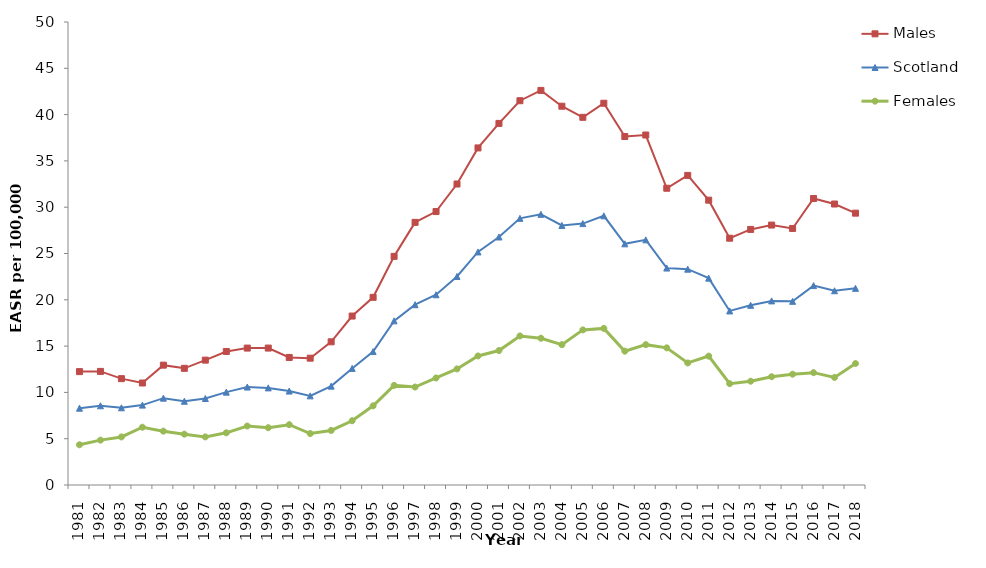
| Category | Males | Scotland | Females |
|---|---|---|---|
| 1981.0 | 12.244 | 8.294 | 4.344 |
| 1982.0 | 12.266 | 8.556 | 4.846 |
| 1983.0 | 11.485 | 8.338 | 5.191 |
| 1984.0 | 11.014 | 8.627 | 6.241 |
| 1985.0 | 12.943 | 9.378 | 5.814 |
| 1986.0 | 12.599 | 9.045 | 5.49 |
| 1987.0 | 13.485 | 9.34 | 5.194 |
| 1988.0 | 14.419 | 10.028 | 5.636 |
| 1989.0 | 14.786 | 10.577 | 6.368 |
| 1990.0 | 14.787 | 10.487 | 6.188 |
| 1991.0 | 13.774 | 10.144 | 6.514 |
| 1992.0 | 13.695 | 9.625 | 5.555 |
| 1993.0 | 15.462 | 10.678 | 5.893 |
| 1994.0 | 18.244 | 12.591 | 6.938 |
| 1995.0 | 20.268 | 14.408 | 8.549 |
| 1996.0 | 24.692 | 17.724 | 10.757 |
| 1997.0 | 28.363 | 19.47 | 10.578 |
| 1998.0 | 29.53 | 20.544 | 11.557 |
| 1999.0 | 32.503 | 22.52 | 12.536 |
| 2000.0 | 36.4 | 25.168 | 13.937 |
| 2001.0 | 39.049 | 26.784 | 14.519 |
| 2002.0 | 41.498 | 28.798 | 16.098 |
| 2003.0 | 42.611 | 29.231 | 15.85 |
| 2004.0 | 40.906 | 28.029 | 15.153 |
| 2005.0 | 39.706 | 28.228 | 16.75 |
| 2006.0 | 41.227 | 29.07 | 16.913 |
| 2007.0 | 37.634 | 26.043 | 14.452 |
| 2008.0 | 37.796 | 26.476 | 15.156 |
| 2009.0 | 32.047 | 23.429 | 14.811 |
| 2010.0 | 33.434 | 23.307 | 13.181 |
| 2011.0 | 30.761 | 22.34 | 13.919 |
| 2012.0 | 26.652 | 18.799 | 10.946 |
| 2013.0 | 27.599 | 19.404 | 11.208 |
| 2014.0 | 28.07 | 19.881 | 11.692 |
| 2015.0 | 27.705 | 19.836 | 11.967 |
| 2016.0 | 30.938 | 21.536 | 12.133 |
| 2017.0 | 30.343 | 20.979 | 11.614 |
| 2018.0 | 29.357 | 21.238 | 13.12 |